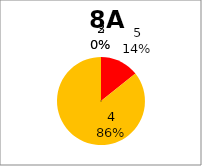
| Category | Series 0 |
|---|---|
| 5.0 | 2 |
| 4.0 | 12 |
| 3.0 | 0 |
| 2.0 | 0 |